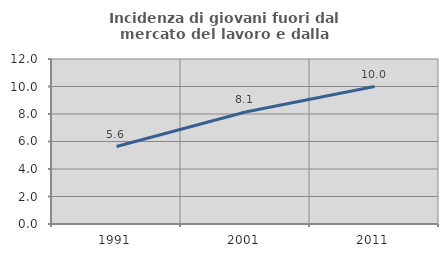
| Category | Incidenza di giovani fuori dal mercato del lavoro e dalla formazione  |
|---|---|
| 1991.0 | 5.634 |
| 2001.0 | 8.145 |
| 2011.0 | 10 |